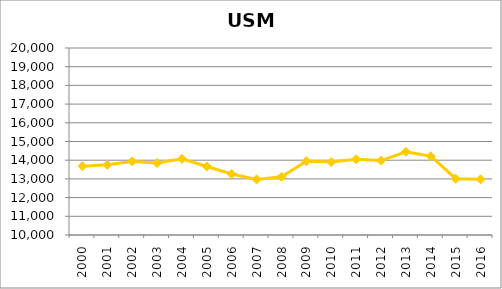
| Category | Series 0 |
|---|---|
| 2000.0 | 13680.533 |
| 2001.0 | 13752.717 |
| 2002.0 | 13934.942 |
| 2003.0 | 13848.042 |
| 2004.0 | 14071.642 |
| 2005.0 | 13665.942 |
| 2006.0 | 13261.692 |
| 2007.0 | 12974.175 |
| 2008.0 | 13114.825 |
| 2009.0 | 13948.467 |
| 2010.0 | 13902.467 |
| 2011.0 | 14051.35 |
| 2012.0 | 13978.633 |
| 2013.0 | 14447.608 |
| 2014.0 | 14212.767 |
| 2015.0 | 13008.858 |
| 2016.0 | 12974.908 |